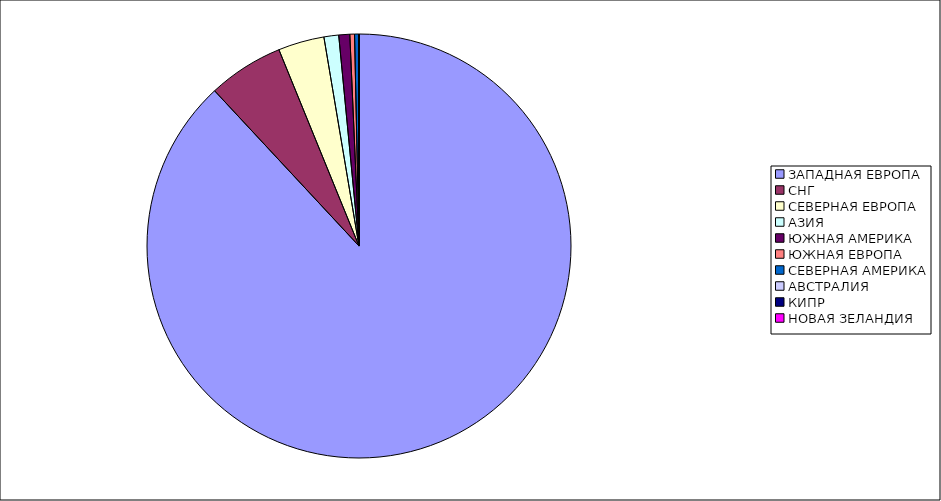
| Category | Оборот |
|---|---|
| ЗАПАДНАЯ ЕВРОПА | 0.881 |
| СНГ | 0.058 |
| СЕВЕРНАЯ ЕВРОПА | 0.035 |
| АЗИЯ | 0.011 |
| ЮЖНАЯ АМЕРИКА | 0.008 |
| ЮЖНАЯ ЕВРОПА | 0.004 |
| СЕВЕРНАЯ АМЕРИКА | 0.003 |
| АВСТРАЛИЯ | 0 |
| КИПР | 0 |
| НОВАЯ ЗЕЛАНДИЯ | 0 |